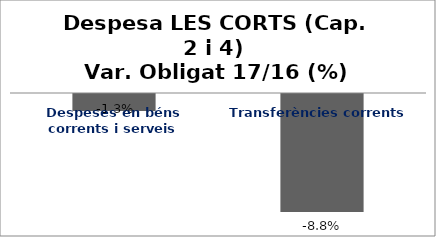
| Category | Series 0 |
|---|---|
| Despeses en béns corrents i serveis | -0.013 |
| Transferències corrents | -0.088 |